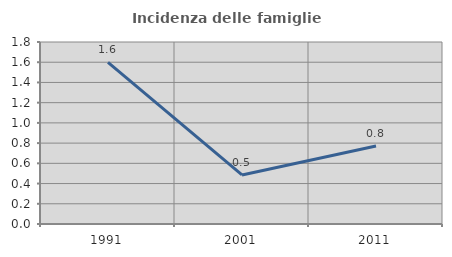
| Category | Incidenza delle famiglie numerose |
|---|---|
| 1991.0 | 1.599 |
| 2001.0 | 0.485 |
| 2011.0 | 0.771 |